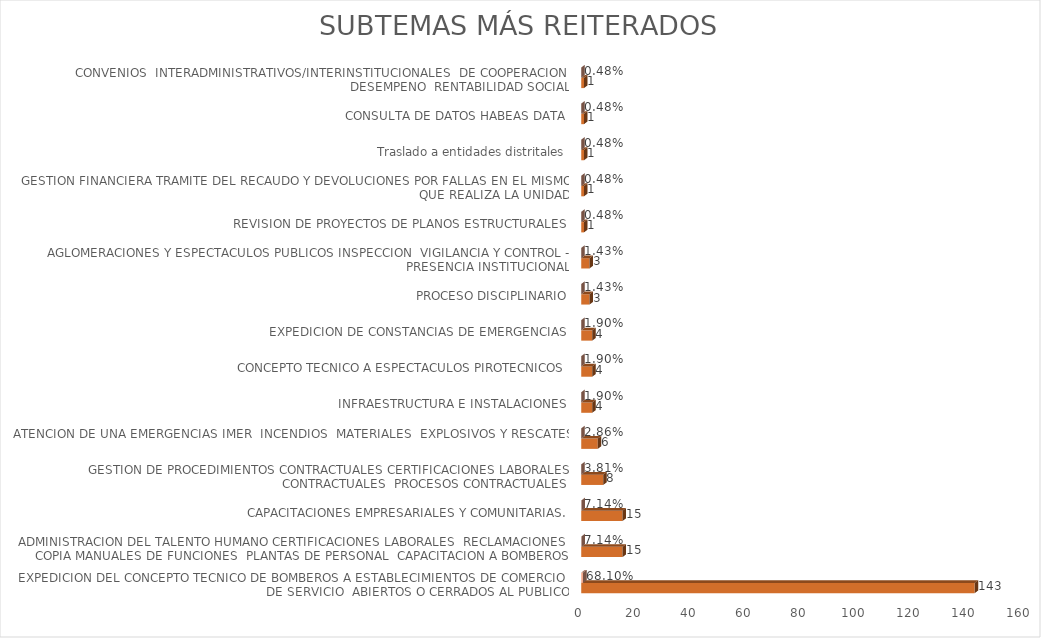
| Category | Cuenta de Número petición | Cuenta de Número petición2 |
|---|---|---|
| EXPEDICION DEL CONCEPTO TECNICO DE BOMBEROS A ESTABLECIMIENTOS DE COMERCIO  DE SERVICIO  ABIERTOS O CERRADOS AL PUBLICO | 143 | 0.681 |
| ADMINISTRACION DEL TALENTO HUMANO CERTIFICACIONES LABORALES  RECLAMACIONES  COPIA MANUALES DE FUNCIONES  PLANTAS DE PERSONAL  CAPACITACION A BOMBEROS | 15 | 0.071 |
| CAPACITACIONES EMPRESARIALES Y COMUNITARIAS. | 15 | 0.071 |
| GESTION DE PROCEDIMIENTOS CONTRACTUALES CERTIFICACIONES LABORALES CONTRACTUALES  PROCESOS CONTRACTUALES | 8 | 0.038 |
| ATENCION DE UNA EMERGENCIAS IMER  INCENDIOS  MATERIALES  EXPLOSIVOS Y RESCATES | 6 | 0.029 |
| INFRAESTRUCTURA E INSTALACIONES | 4 | 0.019 |
| CONCEPTO TECNICO A ESPECTACULOS PIROTECNICOS | 4 | 0.019 |
| EXPEDICION DE CONSTANCIAS DE EMERGENCIAS | 4 | 0.019 |
| PROCESO DISCIPLINARIO | 3 | 0.014 |
| AGLOMERACIONES Y ESPECTACULOS PUBLICOS INSPECCION  VIGILANCIA Y CONTROL - PRESENCIA INSTITUCIONAL | 3 | 0.014 |
| REVISION DE PROYECTOS DE PLANOS ESTRUCTURALES | 1 | 0.005 |
| GESTION FINANCIERA TRAMITE DEL RECAUDO Y DEVOLUCIONES POR FALLAS EN EL MISMO QUE REALIZA LA UNIDAD | 1 | 0.005 |
| Traslado a entidades distritales | 1 | 0.005 |
| CONSULTA DE DATOS HABEAS DATA | 1 | 0.005 |
| CONVENIOS  INTERADMINISTRATIVOS/INTERINSTITUCIONALES  DE COOPERACION  DESEMPENO  RENTABILIDAD SOCIAL | 1 | 0.005 |